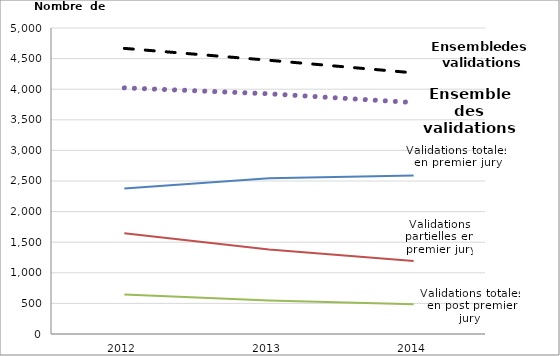
| Category | Validations totales en premier jury | Validations partielles en premier jury | Validations totales en post-premier jury | Ensemble des validations en premier jury | Ensemble des validations |
|---|---|---|---|---|---|
| 2012.0 | 2377 | 1645 | 645 | 4022 | 4667 |
| 2013.0 | 2544 | 1381 | 548 | 3925 | 4473 |
| 2014.0 | 2591 | 1191 | 485 | 3782 | 4267 |